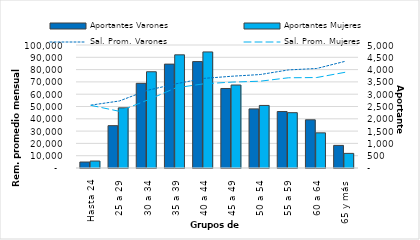
| Category | Aportantes Varones | Aportantes Mujeres |
|---|---|---|
| Hasta 24 | 243 | 283 |
| 25 a 29 | 1721 | 2445 |
| 30 a 34 | 3442 | 3912 |
| 35 a 39 | 4223 | 4600 |
| 40 a 44 | 4326 | 4718 |
| 45 a 49 | 3232 | 3373 |
| 50 a 54 | 2402 | 2543 |
| 55 a 59 | 2295 | 2249 |
| 60 a 64 | 1959 | 1429 |
| 65 y más | 919 | 594 |